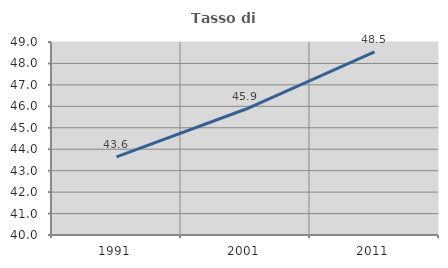
| Category | Tasso di occupazione   |
|---|---|
| 1991.0 | 43.644 |
| 2001.0 | 45.863 |
| 2011.0 | 48.544 |